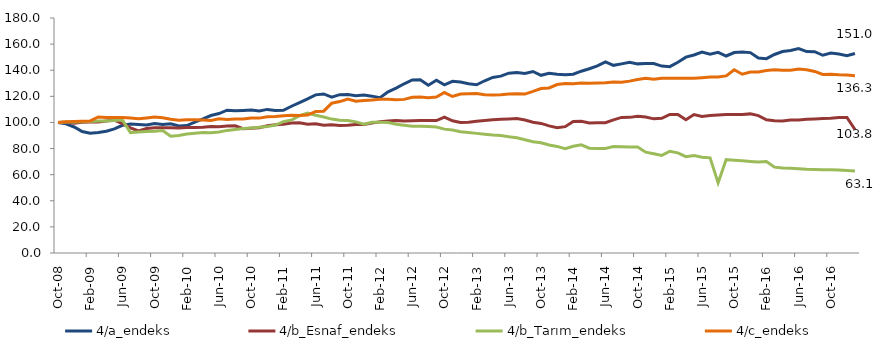
| Category | 4/a_endeks | 4/b_Esnaf_endeks | 4/b_Tarım_endeks | 4/c_endeks |
|---|---|---|---|---|
| 2008-10-01 | 100 | 100 | 100 | 100 |
| 2008-11-01 | 98.935 | 100.067 | 100.274 | 100.533 |
| 2008-12-01 | 96.525 | 99.345 | 100.357 | 100.818 |
| 2009-01-01 | 92.994 | 100.101 | 100.587 | 100.97 |
| 2009-02-01 | 91.692 | 100.433 | 100.811 | 101.174 |
| 2009-03-01 | 92.218 | 100.295 | 101.133 | 104.171 |
| 2009-04-01 | 93.236 | 101.106 | 101.067 | 103.846 |
| 2009-05-01 | 95.118 | 101.83 | 101.43 | 103.771 |
| 2009-06-01 | 97.838 | 99.179 | 101.86 | 103.826 |
| 2009-07-01 | 98.831 | 95.812 | 92.229 | 103.33 |
| 2009-08-01 | 98.44 | 93.49 | 92.613 | 102.755 |
| 2009-09-01 | 98.139 | 95.317 | 93.123 | 103.427 |
| 2009-10-01 | 99.198 | 95.863 | 93.339 | 104.188 |
| 2009-11-01 | 98.422 | 96.001 | 93.78 | 103.588 |
| 2009-12-01 | 99.016 | 95.904 | 89.387 | 102.452 |
| 2010-01-01 | 97.314 | 95.764 | 90 | 101.69 |
| 2010-02-01 | 97.59 | 96.123 | 91.107 | 102.04 |
| 2010-03-01 | 100.177 | 96.134 | 91.79 | 102.098 |
| 2010-04-01 | 102.651 | 96.362 | 92.251 | 101.869 |
| 2010-05-01 | 105.314 | 96.863 | 92.097 | 101.479 |
| 2010-06-01 | 106.833 | 96.794 | 92.748 | 102.853 |
| 2010-07-01 | 109.396 | 97.354 | 93.907 | 102.336 |
| 2010-08-01 | 108.969 | 97.428 | 94.582 | 102.595 |
| 2010-09-01 | 109.208 | 95.149 | 95.298 | 102.686 |
| 2010-10-01 | 109.569 | 95.493 | 95.792 | 103.459 |
| 2010-11-01 | 108.717 | 95.921 | 96.328 | 103.315 |
| 2010-12-01 | 109.988 | 97.478 | 96.811 | 104.33 |
| 2011-01-01 | 109.221 | 98.229 | 98.033 | 104.558 |
| 2011-02-01 | 109.321 | 98.588 | 100.612 | 105.196 |
| 2011-03-01 | 112.413 | 99.516 | 101.801 | 105.426 |
| 2011-04-01 | 115.262 | 99.786 | 105.131 | 105.398 |
| 2011-05-01 | 118.106 | 98.674 | 107.104 | 105.683 |
| 2011-06-01 | 121.118 | 98.914 | 105.476 | 108.355 |
| 2011-07-01 | 121.848 | 97.803 | 104.171 | 108.628 |
| 2011-08-01 | 119.374 | 98.244 | 102.575 | 114.705 |
| 2011-09-01 | 121.29 | 97.613 | 101.631 | 115.992 |
| 2011-10-01 | 121.471 | 97.839 | 101.466 | 117.899 |
| 2011-11-01 | 120.442 | 98.353 | 100.461 | 116.266 |
| 2011-12-01 | 120.954 | 98.449 | 98.626 | 116.749 |
| 2012-01-01 | 120.146 | 99.482 | 100.185 | 117.162 |
| 2012-02-01 | 118.92 | 100.562 | 100.104 | 117.765 |
| 2012-03-01 | 123.437 | 101.136 | 99.885 | 117.683 |
| 2012-04-01 | 126.337 | 101.419 | 98.567 | 117.438 |
| 2012-05-01 | 129.615 | 101.089 | 97.908 | 117.67 |
| 2012-06-01 | 132.535 | 101.329 | 97.098 | 119.337 |
| 2012-07-01 | 132.763 | 101.498 | 97.057 | 119.473 |
| 2012-08-01 | 128.467 | 101.412 | 96.807 | 118.867 |
| 2012-09-01 | 132.337 | 101.441 | 96.462 | 119.458 |
| 2012-10-01 | 128.772 | 104.059 | 94.886 | 122.904 |
| 2012-11-01 | 131.546 | 101.225 | 94.173 | 119.881 |
| 2012-12-01 | 130.918 | 100.007 | 92.918 | 121.704 |
| 2013-01-01 | 129.586 | 100.161 | 92.34 | 121.95 |
| 2013-02-01 | 128.817 | 100.876 | 91.623 | 122.076 |
| 2013-03-01 | 131.918 | 101.456 | 90.988 | 121.189 |
| 2013-04-01 | 134.457 | 102.021 | 90.362 | 121.106 |
| 2013-05-01 | 135.462 | 102.524 | 89.917 | 121.162 |
| 2013-06-01 | 137.734 | 102.699 | 89.012 | 121.736 |
| 2013-07-01 | 138.326 | 102.96 | 88.251 | 121.992 |
| 2013-08-01 | 137.53 | 101.831 | 86.718 | 121.726 |
| 2013-09-01 | 139.029 | 100.141 | 85.282 | 123.736 |
| 2013-10-01 | 136.108 | 99.267 | 84.435 | 126.014 |
| 2013-11-01 | 137.694 | 97.366 | 82.715 | 126.433 |
| 2013-12-01 | 136.888 | 95.922 | 81.629 | 129.054 |
| 2014-01-01 | 136.492 | 96.789 | 79.843 | 129.761 |
| 2014-02-01 | 136.909 | 100.784 | 81.76 | 129.662 |
| 2014-03-01 | 139.257 | 100.965 | 82.863 | 130.252 |
| 2014-04-01 | 141.106 | 99.594 | 80.306 | 130.035 |
| 2014-05-01 | 143.297 | 99.709 | 80.129 | 130.238 |
| 2014-06-01 | 146.399 | 99.798 | 80.126 | 130.365 |
| 2014-07-01 | 143.748 | 101.999 | 81.533 | 130.946 |
| 2014-08-01 | 144.871 | 103.846 | 81.397 | 130.707 |
| 2014-09-01 | 146.071 | 103.888 | 81.14 | 131.638 |
| 2014-10-01 | 144.864 | 104.794 | 81.14 | 132.937 |
| 2014-11-01 | 145.148 | 104.206 | 77.207 | 133.891 |
| 2014-12-01 | 145.178 | 102.763 | 76.004 | 133.019 |
| 2015-01-01 | 143.184 | 103.199 | 74.76 | 133.774 |
| 2015-02-01 | 142.755 | 106.15 | 77.956 | 133.898 |
| 2015-03-01 | 146.143 | 106.043 | 76.683 | 133.768 |
| 2015-04-01 | 150.015 | 102.065 | 73.794 | 133.867 |
| 2015-05-01 | 151.651 | 106.083 | 74.577 | 133.866 |
| 2015-06-01 | 153.878 | 104.504 | 73.283 | 134.239 |
| 2015-07-01 | 152.318 | 105.228 | 72.88 | 134.75 |
| 2015-08-01 | 153.744 | 105.668 | 53.732 | 134.833 |
| 2015-09-01 | 150.899 | 106.118 | 71.576 | 135.643 |
| 2015-10-01 | 153.562 | 106.061 | 71.049 | 140.372 |
| 2015-11-01 | 153.949 | 106.153 | 70.59 | 136.949 |
| 2015-12-01 | 153.503 | 106.56 | 70.101 | 138.633 |
| 2016-01-01 | 149.352 | 105.273 | 69.686 | 138.685 |
| 2016-02-01 | 148.851 | 102.039 | 70.101 | 139.835 |
| 2016-03-01 | 152.049 | 101.336 | 65.771 | 140.267 |
| 2016-04-01 | 154.276 | 101.116 | 65.075 | 139.961 |
| 2016-05-01 | 155.081 | 101.782 | 64.948 | 140.05 |
| 2016-06-01 | 156.528 | 101.875 | 64.504 | 140.931 |
| 2016-07-01 | 154.25 | 102.447 | 64.181 | 140.404 |
| 2016-08-01 | 154.162 | 102.712 | 63.995 | 139.057 |
| 2016-09-01 | 151.462 | 102.978 | 63.776 | 136.796 |
| 2016-10-01 | 153.104 | 103.153 | 63.692 | 136.859 |
| 2016-11-01 | 152.418 | 103.874 | 63.498 | 136.504 |
| 2016-12-01 | 151.045 | 103.836 | 63.115 | 136.328 |
| 2017-01-01 | 152.772 | 94.569 | 62.727 | 135.805 |